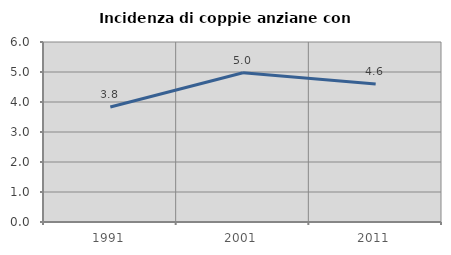
| Category | Incidenza di coppie anziane con figli |
|---|---|
| 1991.0 | 3.836 |
| 2001.0 | 4.976 |
| 2011.0 | 4.596 |